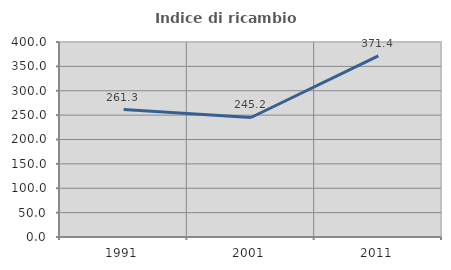
| Category | Indice di ricambio occupazionale  |
|---|---|
| 1991.0 | 261.29 |
| 2001.0 | 245.161 |
| 2011.0 | 371.429 |